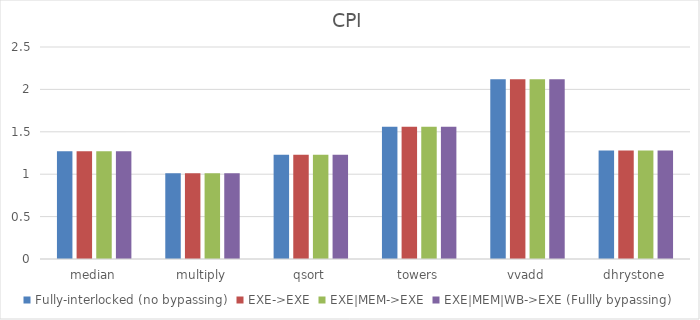
| Category | Fully-interlocked (no bypassing) | EXE->EXE | EXE|MEM->EXE | EXE|MEM|WB->EXE (Fullly bypassing) |
|---|---|---|---|---|
| median | 1.27 | 1.27 | 1.27 | 1.27 |
| multiply | 1.01 | 1.01 | 1.01 | 1.01 |
| qsort | 1.23 | 1.23 | 1.23 | 1.23 |
| towers | 1.56 | 1.56 | 1.56 | 1.56 |
| vvadd | 2.12 | 2.12 | 2.12 | 2.12 |
| dhrystone | 1.28 | 1.28 | 1.28 | 1.28 |